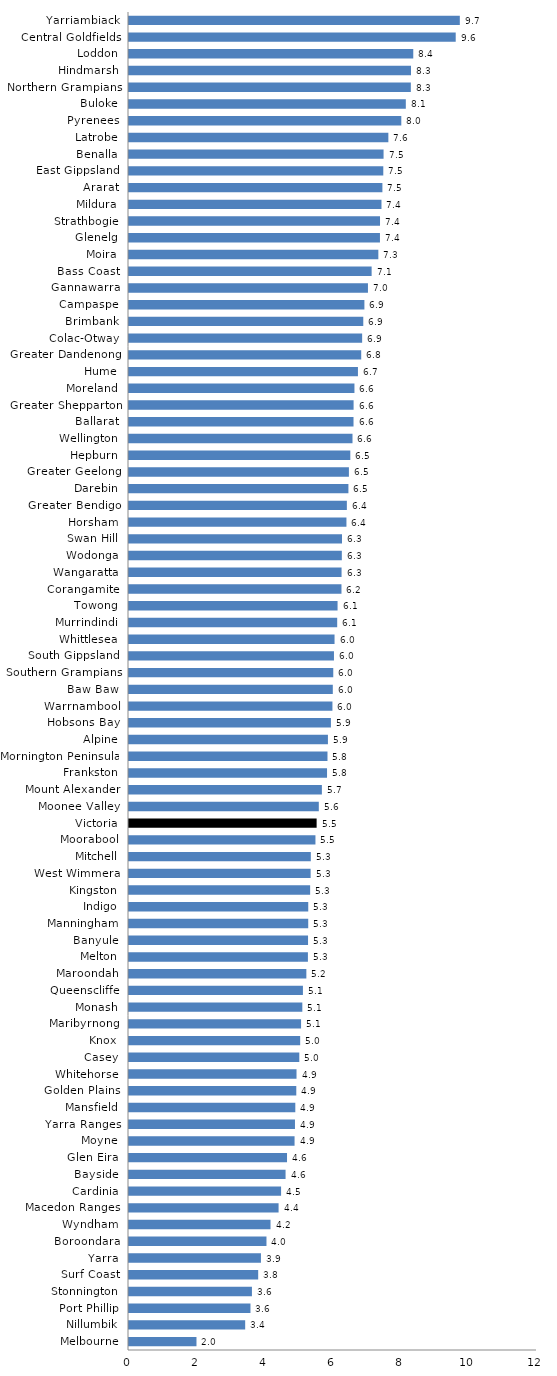
| Category | Series 0 |
|---|---|
| Melbourne | 1.985 |
| Nillumbik | 3.417 |
| Port Phillip | 3.573 |
| Stonnington | 3.616 |
| Surf Coast | 3.8 |
| Yarra | 3.881 |
| Boroondara | 4.043 |
| Wyndham | 4.162 |
| Macedon Ranges | 4.399 |
| Cardinia | 4.473 |
| Bayside | 4.605 |
| Glen Eira | 4.648 |
| Moyne | 4.87 |
| Yarra Ranges | 4.882 |
| Mansfield | 4.891 |
| Golden Plains | 4.92 |
| Whitehorse | 4.927 |
| Casey | 5.009 |
| Knox | 5.035 |
| Maribyrnong | 5.061 |
| Monash | 5.098 |
| Queenscliffe | 5.115 |
| Maroondah | 5.216 |
| Melton | 5.262 |
| Banyule | 5.266 |
| Manningham | 5.271 |
| Indigo | 5.272 |
| Kingston | 5.328 |
| West Wimmera | 5.342 |
| Mitchell | 5.347 |
| Moorabool | 5.484 |
| Victoria | 5.518 |
| Moonee Valley | 5.583 |
| Mount Alexander | 5.673 |
| Frankston | 5.825 |
| Mornington Peninsula | 5.838 |
| Alpine | 5.851 |
| Hobsons Bay | 5.939 |
| Warrnambool | 5.983 |
| Baw Baw | 5.994 |
| Southern Grampians | 6.008 |
| South Gippsland | 6.029 |
| Whittlesea | 6.046 |
| Murrindindi | 6.123 |
| Towong | 6.134 |
| Corangamite | 6.249 |
| Wangaratta | 6.252 |
| Wodonga | 6.26 |
| Swan Hill | 6.265 |
| Horsham | 6.395 |
| Greater Bendigo | 6.408 |
| Darebin | 6.453 |
| Greater Geelong | 6.468 |
| Hepburn | 6.509 |
| Wellington | 6.573 |
| Ballarat | 6.603 |
| Greater Shepparton | 6.606 |
| Moreland | 6.631 |
| Hume | 6.734 |
| Greater Dandenong | 6.83 |
| Colac-Otway | 6.857 |
| Brimbank | 6.89 |
| Campaspe | 6.924 |
| Gannawarra | 7.028 |
| Bass Coast | 7.136 |
| Moira | 7.334 |
| Glenelg | 7.381 |
| Strathbogie | 7.383 |
| Mildura | 7.426 |
| Ararat | 7.453 |
| East Gippsland | 7.479 |
| Benalla | 7.487 |
| Latrobe | 7.628 |
| Pyrenees | 8.009 |
| Buloke | 8.142 |
| Northern Grampians | 8.289 |
| Hindmarsh | 8.294 |
| Loddon | 8.361 |
| Central Goldfields | 9.609 |
| Yarriambiack | 9.73 |